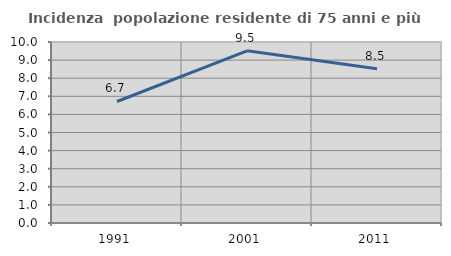
| Category | Incidenza  popolazione residente di 75 anni e più |
|---|---|
| 1991.0 | 6.713 |
| 2001.0 | 9.514 |
| 2011.0 | 8.524 |